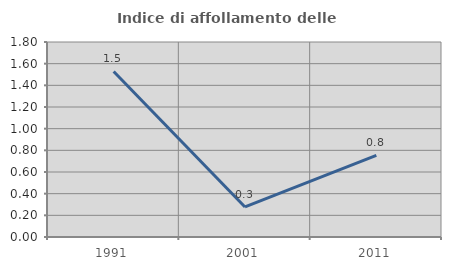
| Category | Indice di affollamento delle abitazioni  |
|---|---|
| 1991.0 | 1.528 |
| 2001.0 | 0.277 |
| 2011.0 | 0.754 |